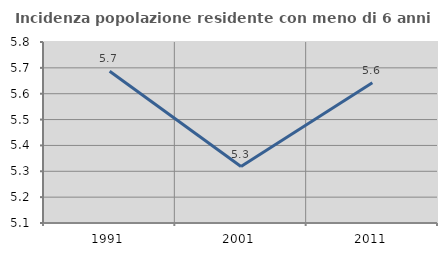
| Category | Incidenza popolazione residente con meno di 6 anni |
|---|---|
| 1991.0 | 5.687 |
| 2001.0 | 5.318 |
| 2011.0 | 5.642 |